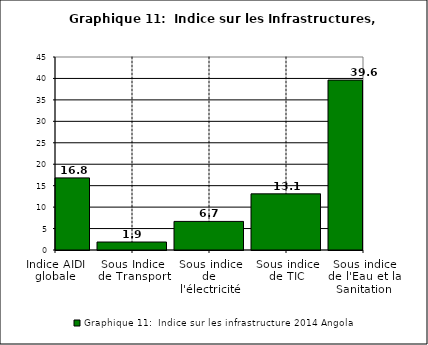
| Category | Graphique 11:  Indice sur les infrastructure 2014 |
|---|---|
| Indice AIDI globale | 16.81 |
| Sous Indice de Transport | 1.859 |
| Sous indice de l'électricité | 6.667 |
| Sous indice de TIC | 13.092 |
| Sous indice de l'Eau et la Sanitation | 39.617 |